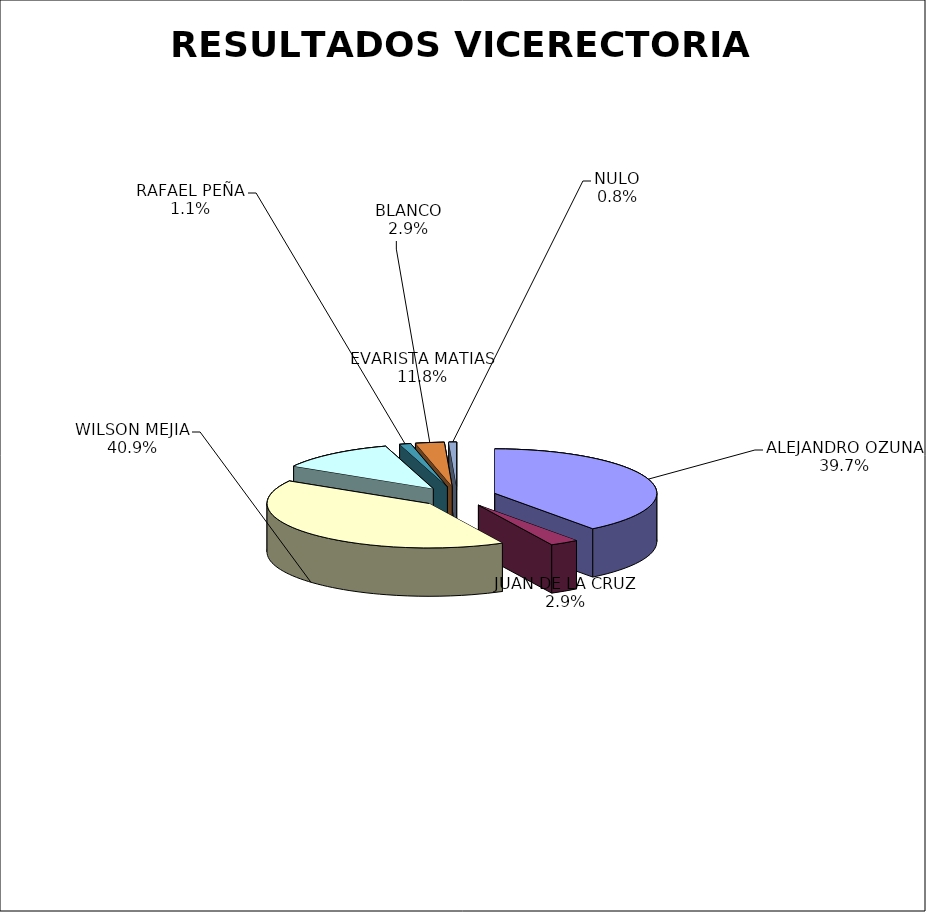
| Category | Series 0 |
|---|---|
| ALEJANDRO OZUNA | 1024 |
| JUAN DE LA CRUZ | 74 |
| WILSON MEJIA | 1057 |
| EVARISTA MATIAS | 304 |
| RAFAEL PEÑA | 29 |
| BLANCO | 74 |
| NULO | 20 |